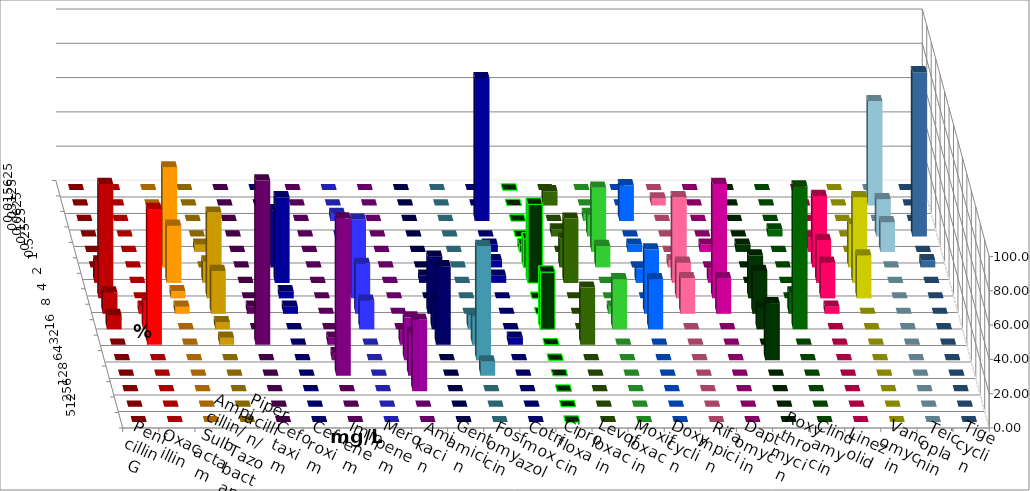
| Category | Penicillin G | Oxacillin | Ampicillin/ Sulbactam | Piperacillin/ Tazobactam | Cefotaxim | Cefuroxim | Imipenem | Meropenem | Amikacin | Gentamicin | Fosfomycin | Cotrimoxazol | Ciprofloxacin | Levofloxacin | Moxifloxacin | Doxycyclin | Rifampicin | Daptomycin | Roxythromycin | Clindamycin | Linezolid | Vancomycin | Teicoplanin | Tigecyclin |
|---|---|---|---|---|---|---|---|---|---|---|---|---|---|---|---|---|---|---|---|---|---|---|---|---|
| 0.015625 | 0 | 0 | 0 | 0 | 0 | 0 | 0 | 0 | 0 | 0 | 0 | 0 | 0 | 0 | 0 | 0 | 0 | 0 | 0 | 0 | 0 | 0 | 0 | 0 |
| 0.03125 | 0 | 0 | 0 | 0 | 0 | 0 | 0 | 0 | 0 | 0 | 0 | 0 | 0 | 8.333 | 0 | 0 | 4.167 | 0 | 0 | 0 | 0 | 0 | 0 | 60.87 |
| 0.0625 | 0 | 0 | 0 | 0 | 0 | 0 | 4.167 | 4.167 | 0 | 0 | 0 | 83.333 | 0 | 0 | 4.167 | 20.833 | 0 | 0 | 0 | 0 | 0 | 0 | 0 | 0 |
| 0.125 | 0 | 0 | 0 | 0 | 0 | 0 | 0 | 0 | 0 | 0 | 0 | 0 | 0 | 4.167 | 12.5 | 0 | 0 | 0 | 0 | 4.167 | 0 | 0 | 95.833 | 21.739 |
| 0.25 | 0 | 0 | 0 | 4.167 | 0 | 0 | 4.167 | 0 | 0 | 0 | 0 | 4.167 | 4.167 | 0 | 37.5 | 4.167 | 0 | 4.167 | 4.167 | 0 | 8.333 | 0 | 0 | 17.391 |
| 0.5 | 0 | 0 | 58.333 | 0 | 0 | 0 | 33.333 | 0 | 0 | 0 | 0 | 4.167 | 16.667 | 16.667 | 12.5 | 0 | 4.167 | 0 | 0 | 0 | 41.667 | 25 | 4.167 | 0 |
| 1.0 | 12.5 | 0 | 33.333 | 12.5 | 0 | 0 | 50 | 4.167 | 0 | 4.167 | 0 | 4.167 | 45.833 | 37.5 | 0 | 8.333 | 50 | 8.333 | 0 | 0 | 25 | 50 | 0 | 0 |
| 2.0 | 66.667 | 0 | 4.167 | 50 | 0 | 0 | 4.167 | 45.833 | 0 | 0 | 0 | 0 | 0 | 0 | 0 | 0 | 20.833 | 66.667 | 25 | 0 | 20.833 | 25 | 0 | 0 |
| 4.0 | 12.5 | 4.167 | 4.167 | 25 | 4.167 | 0 | 4.167 | 29.167 | 0 | 33.333 | 0 | 0 | 0 | 0 | 4.167 | 37.5 | 20.833 | 20.833 | 25 | 12.5 | 4.167 | 0 | 0 | 0 |
| 8.0 | 8.333 | 16.667 | 0 | 4.167 | 0 | 0 | 0 | 16.667 | 0 | 16.667 | 8.333 | 0 | 33.333 | 0 | 29.167 | 29.167 | 0 | 0 | 12.5 | 83.333 | 0 | 0 | 0 | 0 |
| 16.0 | 0 | 79.167 | 0 | 4.167 | 95.833 | 4.167 | 0 | 0 | 8.333 | 45.833 | 16.667 | 4.167 | 0 | 33.333 | 0 | 0 | 0 | 0 | 0 | 0 | 0 | 0 | 0 | 0 |
| 32.0 | 0 | 0 | 0 | 0 | 0 | 4.167 | 0 | 0 | 25 | 0 | 66.667 | 0 | 0 | 0 | 0 | 0 | 0 | 0 | 33.333 | 0 | 0 | 0 | 0 | 0 |
| 64.0 | 0 | 0 | 0 | 0 | 0 | 91.667 | 0 | 0 | 25 | 0 | 8.333 | 0 | 0 | 0 | 0 | 0 | 0 | 0 | 0 | 0 | 0 | 0 | 0 | 0 |
| 128.0 | 0 | 0 | 0 | 0 | 0 | 0 | 0 | 0 | 41.667 | 0 | 0 | 0 | 0 | 0 | 0 | 0 | 0 | 0 | 0 | 0 | 0 | 0 | 0 | 0 |
| 256.0 | 0 | 0 | 0 | 0 | 0 | 0 | 0 | 0 | 0 | 0 | 0 | 0 | 0 | 0 | 0 | 0 | 0 | 0 | 0 | 0 | 0 | 0 | 0 | 0 |
| 512.0 | 0 | 0 | 0 | 0 | 0 | 0 | 0 | 0 | 0 | 0 | 0 | 0 | 0 | 0 | 0 | 0 | 0 | 0 | 0 | 0 | 0 | 0 | 0 | 0 |